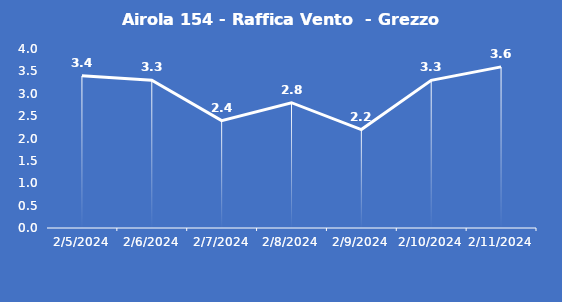
| Category | Airola 154 - Raffica Vento  - Grezzo (m/s) |
|---|---|
| 2/5/24 | 3.4 |
| 2/6/24 | 3.3 |
| 2/7/24 | 2.4 |
| 2/8/24 | 2.8 |
| 2/9/24 | 2.2 |
| 2/10/24 | 3.3 |
| 2/11/24 | 3.6 |